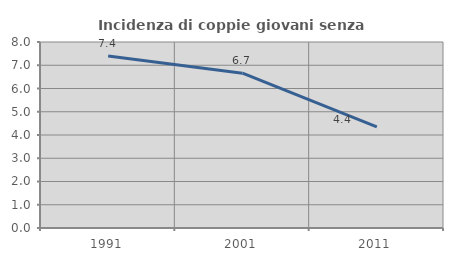
| Category | Incidenza di coppie giovani senza figli |
|---|---|
| 1991.0 | 7.396 |
| 2001.0 | 6.658 |
| 2011.0 | 4.353 |